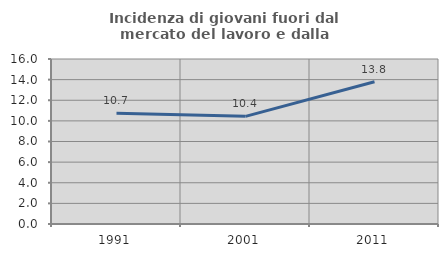
| Category | Incidenza di giovani fuori dal mercato del lavoro e dalla formazione  |
|---|---|
| 1991.0 | 10.732 |
| 2001.0 | 10.44 |
| 2011.0 | 13.793 |